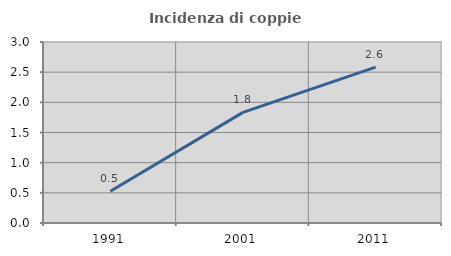
| Category | Incidenza di coppie miste |
|---|---|
| 1991.0 | 0.526 |
| 2001.0 | 1.833 |
| 2011.0 | 2.583 |